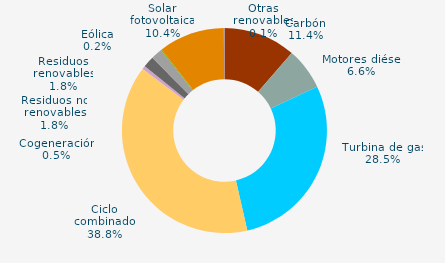
| Category | Series 0 |
|---|---|
| Carbón | 11.383 |
| Motores diésel | 6.579 |
| Turbina de gas | 28.463 |
| Ciclo combinado | 38.837 |
| Generación auxiliar | 0 |
| Cogeneración | 0.544 |
| Residuos no renovables | 1.765 |
| Residuos renovables | 1.765 |
| Eólica | 0.17 |
| Solar fotovoltaica | 10.393 |
| Otras renovables | 0.101 |